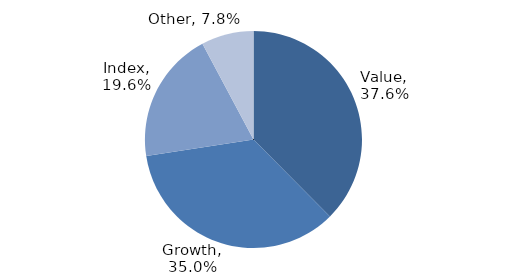
| Category | Investment Style |
|---|---|
| Value | 0.376 |
| Growth | 0.35 |
| Index | 0.196 |
| Other | 0.078 |